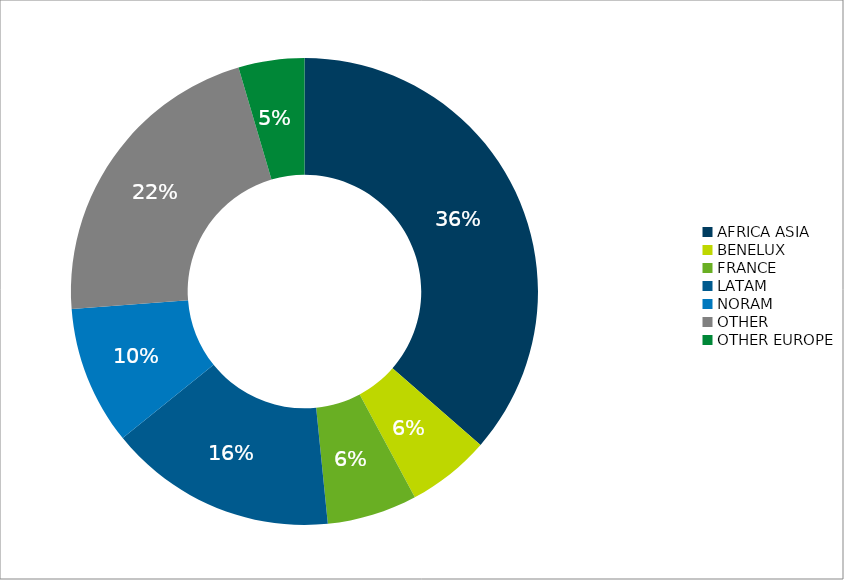
| Category | Total |
|---|---|
| AFRICA ASIA | 42937.513 |
| BENELUX | 6788.947 |
| FRANCE | 7360.329 |
| LATAM | 18628.683 |
| NORAM | 11331.4 |
| OTHER | 25503.689 |
| OTHER EUROPE | 5378.826 |